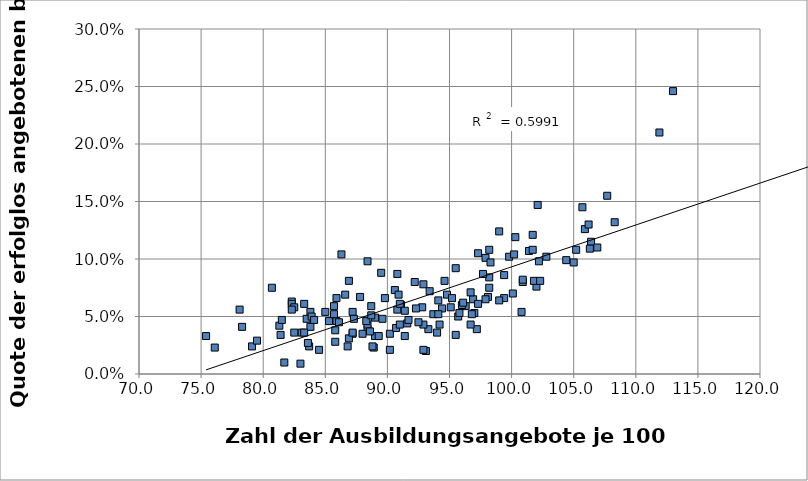
| Category | Anteil unbesetzter betrieblicher Plätze |
|---|---|
| 113.0 | 0.246 |
| 92.8 | 0.058 |
| 99.8 | 0.102 |
| 101.7 | 0.121 |
| 128.9 | 0.277 |
| 97.3 | 0.105 |
| 82.3 | 0.063 |
| 83.8 | 0.054 |
| 102.1 | 0.147 |
| 97.9 | 0.101 |
| 90.8 | 0.087 |
| 90.6 | 0.073 |
| 94.8 | 0.069 |
| 96.3 | 0.059 |
| 93.1 | 0.02 |
| 102.0 | 0.076 |
| 101.4 | 0.107 |
| 91.1 | 0.06 |
| 106.4 | 0.115 |
| 86.3 | 0.104 |
| 97.2 | 0.039 |
| 100.8 | 0.054 |
| 89.0 | 0.033 |
| 90.9 | 0.069 |
| 99.0 | 0.124 |
| 105.7 | 0.145 |
| 88.4 | 0.098 |
| 98.3 | 0.097 |
| 98.1 | 0.067 |
| 100.1 | 0.07 |
| 100.3 | 0.119 |
| 96.7 | 0.043 |
| 98.2 | 0.108 |
| 111.9 | 0.21 |
| 107.7 | 0.155 |
| 89.3 | 0.033 |
| 91.6 | 0.044 |
| 83.7 | 0.024 |
| 89.0 | 0.049 |
| 85.8 | 0.028 |
| 87.2 | 0.035 |
| 89.5 | 0.088 |
| 90.2 | 0.035 |
| 88.4 | 0.039 |
| 88.4 | 0.043 |
| 83.5 | 0.048 |
| 87.8 | 0.067 |
| 82.3 | 0.061 |
| 76.1 | 0.023 |
| 88.9 | 0.023 |
| 83.3 | 0.061 |
| 81.4 | 0.034 |
| 82.5 | 0.058 |
| 86.9 | 0.031 |
| 83.8 | 0.041 |
| 88.3 | 0.046 |
| 81.3 | 0.042 |
| 92.9 | 0.021 |
| 83.9 | 0.05 |
| 89.8 | 0.066 |
| 84.1 | 0.047 |
| 86.8 | 0.024 |
| 83.1 | 0.036 |
| 88.7 | 0.059 |
| 86.6 | 0.069 |
| 93.3 | 0.039 |
| 85.3 | 0.046 |
| 87.2 | 0.036 |
| 96.9 | 0.065 |
| 90.7 | 0.04 |
| 88.8 | 0.024 |
| 78.3 | 0.041 |
| 79.1 | 0.024 |
| 83.6 | 0.027 |
| 81.7 | 0.01 |
| 86.9 | 0.081 |
| 92.9 | 0.043 |
| 82.5 | 0.036 |
| 85.0 | 0.054 |
| 81.5 | 0.047 |
| 94.0 | 0.036 |
| 79.5 | 0.029 |
| 88.6 | 0.037 |
| 75.4 | 0.033 |
| 88.7 | 0.051 |
| 88.0 | 0.035 |
| 94.1 | 0.064 |
| 85.8 | 0.038 |
| 78.1 | 0.056 |
| 95.7 | 0.05 |
| 85.9 | 0.046 |
| 97.3 | 0.061 |
| 82.3 | 0.056 |
| 86.1 | 0.045 |
| 87.2 | 0.054 |
| 83.0 | 0.009 |
| 84.5 | 0.021 |
| 80.7 | 0.075 |
| 83.3 | 0.036 |
| 95.5 | 0.092 |
| 92.3 | 0.057 |
| 87.3 | 0.048 |
| 85.7 | 0.059 |
| 95.5 | 0.034 |
| 91.4 | 0.033 |
| 89.6 | 0.048 |
| 85.7 | 0.052 |
| 85.9 | 0.066 |
| 90.8 | 0.056 |
| 92.5 | 0.045 |
| 94.2 | 0.043 |
| 94.4 | 0.057 |
| 98.2 | 0.084 |
| 92.9 | 0.078 |
| 96.0 | 0.06 |
| 92.2 | 0.08 |
| 91.7 | 0.047 |
| 95.1 | 0.058 |
| 100.9 | 0.08 |
| 95.8 | 0.053 |
| 99.4 | 0.066 |
| 97.0 | 0.053 |
| 94.6 | 0.081 |
| 90.2 | 0.021 |
| 95.2 | 0.066 |
| 91.0 | 0.061 |
| 91.4 | 0.055 |
| 96.1 | 0.062 |
| 101.8 | 0.081 |
| 93.7 | 0.052 |
| 101.7 | 0.108 |
| 94.1 | 0.052 |
| 98.2 | 0.075 |
| 97.9 | 0.065 |
| 93.4 | 0.072 |
| 97.7 | 0.087 |
| 105.9 | 0.126 |
| 106.9 | 0.11 |
| 99.4 | 0.086 |
| 96.8 | 0.052 |
| 100.2 | 0.104 |
| 96.7 | 0.071 |
| 102.3 | 0.081 |
| 102.2 | 0.098 |
| 105.2 | 0.108 |
| 99.0 | 0.064 |
| 102.8 | 0.102 |
| 106.3 | 0.109 |
| 104.4 | 0.099 |
| 108.3 | 0.132 |
| 100.9 | 0.082 |
| 105.0 | 0.097 |
| 106.2 | 0.13 |
| 91.0 | 0.043 |